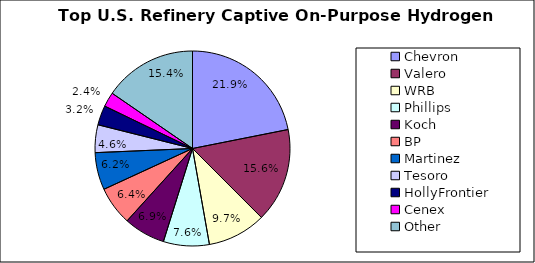
| Category | Series 0 |
|---|---|
| Chevron | 0.219 |
| Valero | 0.156 |
| WRB | 0.097 |
| Phillips | 0.076 |
| Koch | 0.069 |
| BP | 0.064 |
| Martinez | 0.062 |
| Tesoro | 0.046 |
| HollyFrontier | 0.032 |
| Cenex | 0.024 |
| Other | 0.154 |